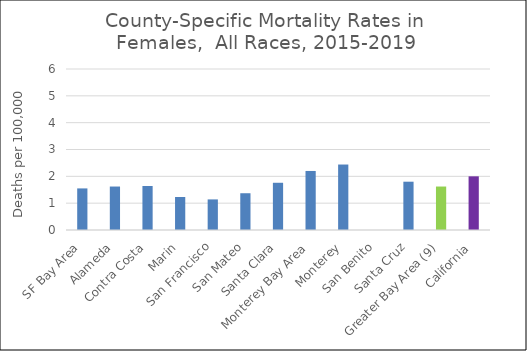
| Category | Female |
|---|---|
| SF Bay Area | 1.55 |
|   Alameda | 1.62 |
|   Contra Costa | 1.64 |
|   Marin | 1.23 |
|   San Francisco | 1.14 |
|   San Mateo | 1.37 |
|   Santa Clara | 1.76 |
| Monterey Bay Area | 2.2 |
|   Monterey | 2.44 |
|   San Benito | 0 |
|   Santa Cruz | 1.8 |
| Greater Bay Area (9) | 1.62 |
| California | 2 |